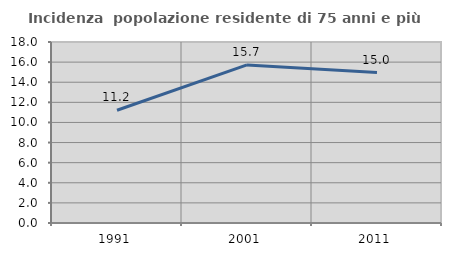
| Category | Incidenza  popolazione residente di 75 anni e più |
|---|---|
| 1991.0 | 11.215 |
| 2001.0 | 15.721 |
| 2011.0 | 14.961 |